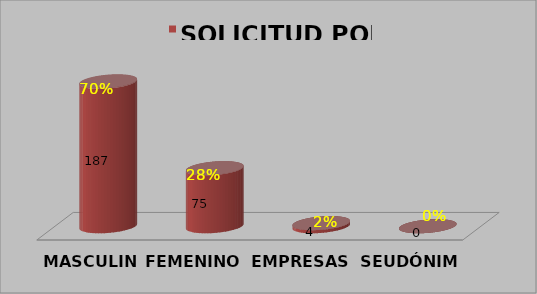
| Category | SOLICITUD POR GÉNERO | Series 1 |
|---|---|---|
| MASCULINO | 187 | 0.703 |
| FEMENINO | 75 | 0.282 |
| EMPRESAS | 4 | 0.015 |
| SEUDÓNIMO | 0 | 0 |